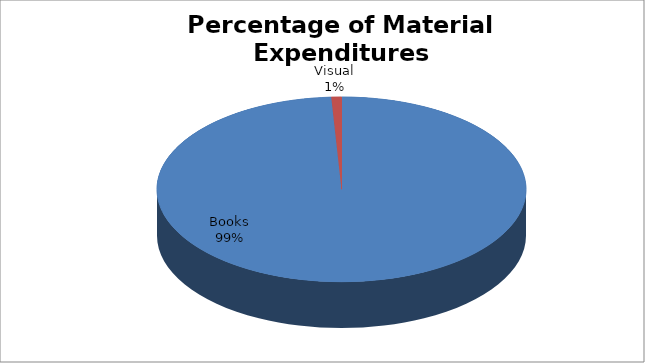
| Category | Series 0 |
|---|---|
| Books | 16813.04 |
| Visual | 149.89 |